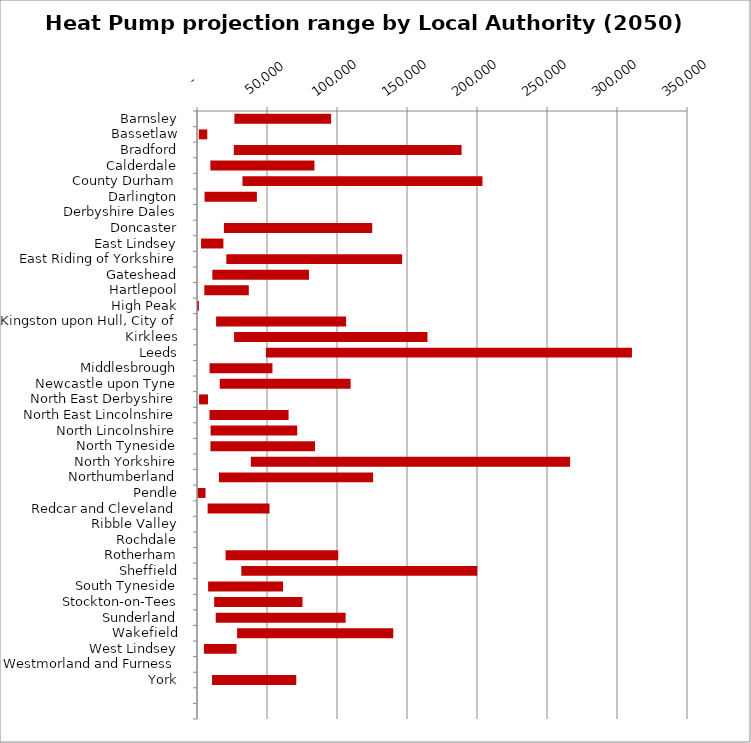
| Category | MIN | MAX |
|---|---|---|
| Barnsley | 26714 | 69102 |
| Bassetlaw | 1280 | 6076 |
| Bradford | 26301 | 162678 |
| Calderdale | 9542 | 74351 |
| County Durham | 32475 | 171444 |
| Darlington | 5390 | 37376 |
| Derbyshire Dales | 18 | 87 |
| Doncaster | 19227 | 105935 |
| East Lindsey | 2889 | 15979 |
| East Riding of Yorkshire | 20964 | 125569 |
| Gateshead | 10972 | 69011 |
| Hartlepool | 5219 | 31785 |
| High Peak | 197 | 1170 |
| Kingston upon Hull, City of | 13659 | 92883 |
| Kirklees | 26504 | 138139 |
| Leeds | 49204 | 261461 |
| Middlesbrough | 8967 | 44944 |
| Newcastle upon Tyne | 16234 | 93500 |
| North East Derbyshire | 1461 | 6400 |
| North East Lincolnshire | 8897 | 56508 |
| North Lincolnshire | 9725 | 61880 |
| North Tyneside | 9602 | 74677 |
| North Yorkshire | 38477 | 228028 |
| Northumberland | 15669 | 110110 |
| Pendle | 484 | 5608 |
| Redcar and Cleveland | 7590 | 44207 |
| Ribble Valley | 6 | 53 |
| Rochdale | 2 | 13 |
| Rotherham | 20421 | 80458 |
| Sheffield | 31664 | 168534 |
| South Tyneside | 7942 | 53531 |
| Stockton-on-Tees | 12274 | 63080 |
| Sunderland | 13380 | 92784 |
| Wakefield | 28637 | 111558 |
| West Lindsey | 4922 | 23346 |
| Westmorland and Furness | 1 | 8 |
| York | 10762 | 60158 |